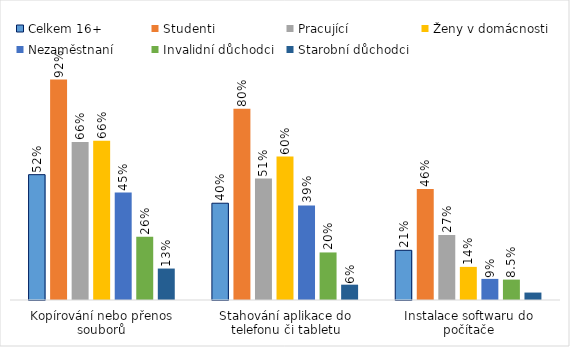
| Category | Celkem 16+ | Studenti | Pracující | Ženy v domácnosti | Nezaměstnaní | Invalidní důchodci | Starobní důchodci |
|---|---|---|---|---|---|---|---|
| Kopírování nebo přenos souborů | 0.522 | 0.918 | 0.658 | 0.663 | 0.447 | 0.264 | 0.131 |
| Stahování aplikace do telefonu či tabletu | 0.403 | 0.797 | 0.506 | 0.598 | 0.394 | 0.198 | 0.064 |
| Instalace softwaru do počítače | 0.207 | 0.462 | 0.271 | 0.138 | 0.088 | 0.085 | 0.031 |